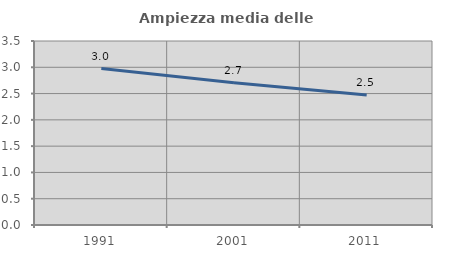
| Category | Ampiezza media delle famiglie |
|---|---|
| 1991.0 | 2.975 |
| 2001.0 | 2.706 |
| 2011.0 | 2.471 |